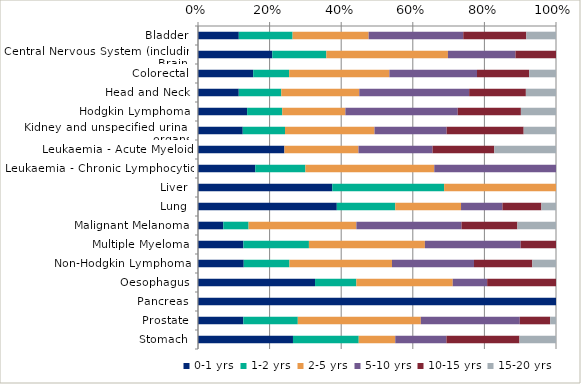
| Category | 0-1 yrs | 1-2 yrs | 2-5 yrs | 5-10 yrs | 10-15 yrs | 15-20 yrs |
|---|---|---|---|---|---|---|
| Bladder | 0.114 | 0.15 | 0.212 | 0.264 | 0.176 | 0.083 |
| Central Nervous System (including Brain) | 0.208 | 0.151 | 0.34 | 0.189 | 0.113 | 0 |
| Colorectal | 0.154 | 0.1 | 0.28 | 0.245 | 0.146 | 0.075 |
| Head and Neck | 0.114 | 0.119 | 0.218 | 0.307 | 0.158 | 0.084 |
| Hodgkin Lymphoma | 0.137 | 0.098 | 0.176 | 0.314 | 0.176 | 0.098 |
| Kidney and unspecified urinary organs | 0.125 | 0.118 | 0.25 | 0.201 | 0.215 | 0.09 |
| Leukaemia - Acute Myeloid | 0.241 | 0 | 0.207 | 0.207 | 0.172 | 0.172 |
| Leukaemia - Chronic Lymphocytic | 0.16 | 0.14 | 0.36 | 0.34 | 0 | 0 |
| Liver | 0.375 | 0.312 | 0.312 | 0 | 0 | 0 |
| Lung | 0.388 | 0.163 | 0.184 | 0.116 | 0.109 | 0.041 |
| Malignant Melanoma | 0.071 | 0.071 | 0.301 | 0.294 | 0.156 | 0.108 |
| Multiple Myeloma | 0.127 | 0.183 | 0.324 | 0.268 | 0.099 | 0 |
| Non-Hodgkin Lymphoma | 0.128 | 0.128 | 0.286 | 0.229 | 0.163 | 0.066 |
| Oesophagus | 0.327 | 0.115 | 0.269 | 0.096 | 0.192 | 0 |
| Pancreas | 1 | 0 | 0 | 0 | 0 | 0 |
| Prostate | 0.127 | 0.152 | 0.344 | 0.276 | 0.085 | 0.016 |
| Stomach | 0.265 | 0.184 | 0.102 | 0.143 | 0.204 | 0.102 |